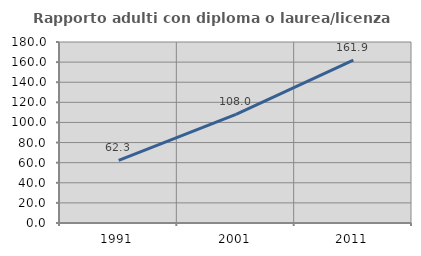
| Category | Rapporto adulti con diploma o laurea/licenza media  |
|---|---|
| 1991.0 | 62.335 |
| 2001.0 | 108.033 |
| 2011.0 | 161.881 |